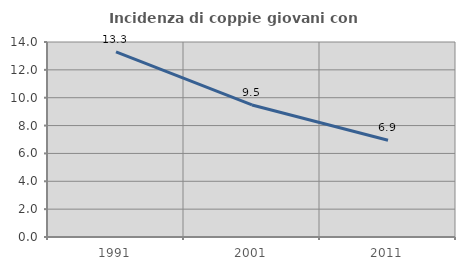
| Category | Incidenza di coppie giovani con figli |
|---|---|
| 1991.0 | 13.292 |
| 2001.0 | 9.482 |
| 2011.0 | 6.946 |